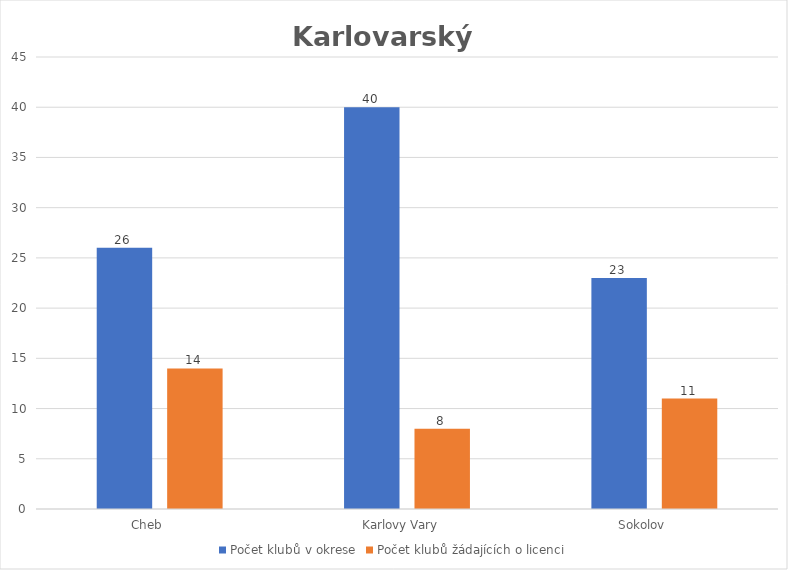
| Category | Počet klubů v okrese | Počet klubů žádajících o licenci |
|---|---|---|
| Cheb       | 26 | 14 |
| Karlovy Vary   | 40 | 8 |
| Sokolov       | 23 | 11 |